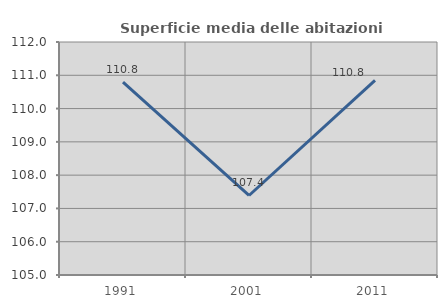
| Category | Superficie media delle abitazioni occupate |
|---|---|
| 1991.0 | 110.795 |
| 2001.0 | 107.389 |
| 2011.0 | 110.846 |